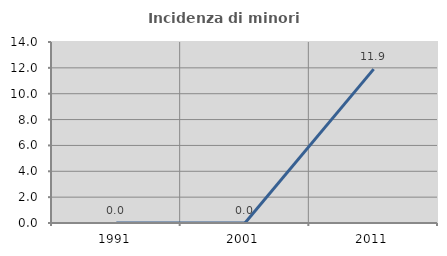
| Category | Incidenza di minori stranieri |
|---|---|
| 1991.0 | 0 |
| 2001.0 | 0 |
| 2011.0 | 11.905 |